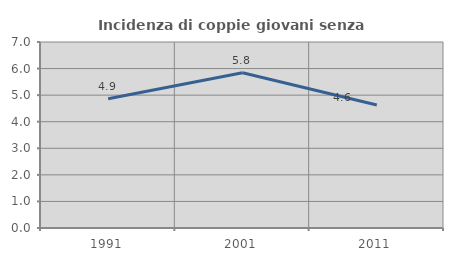
| Category | Incidenza di coppie giovani senza figli |
|---|---|
| 1991.0 | 4.861 |
| 2001.0 | 5.841 |
| 2011.0 | 4.631 |